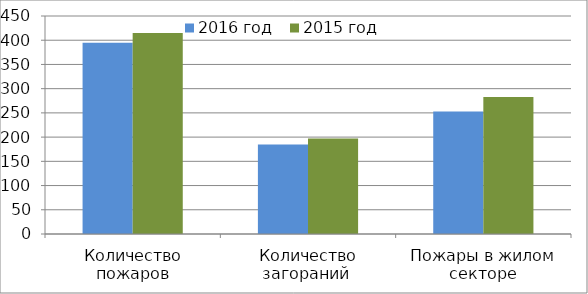
| Category | 2016 год | 2015 год |
|---|---|---|
| Количество пожаров | 395 | 415 |
| Количество загораний  | 185 | 197 |
| Пожары в жилом секторе | 253 | 283 |